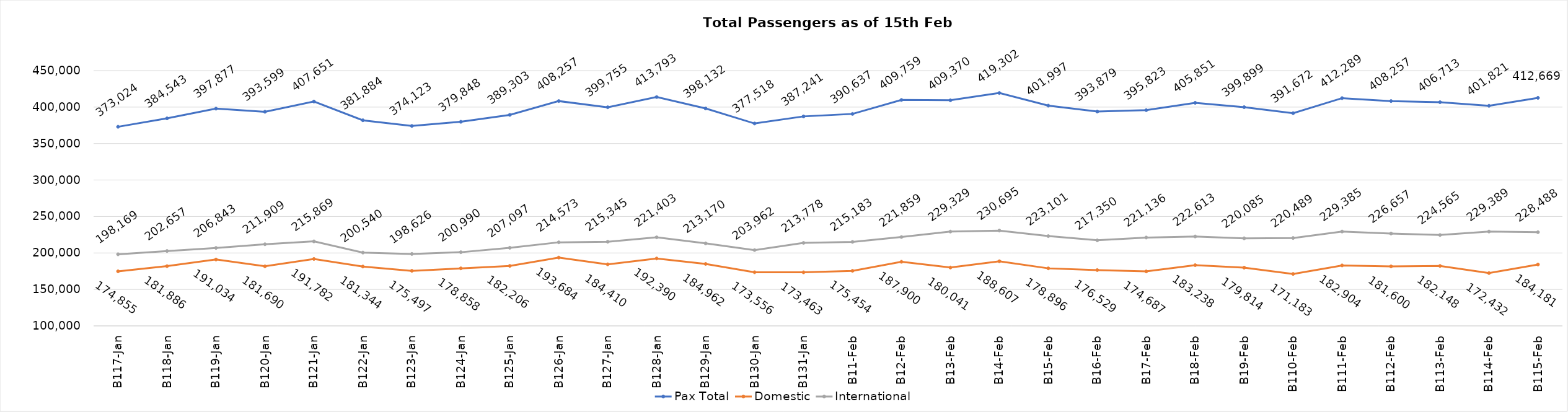
| Category | Pax Total | Domestic | International |
|---|---|---|---|
| 2024-01-17 | 373024 | 174855 | 198169 |
| 2024-01-18 | 384543 | 181886 | 202657 |
| 2024-01-19 | 397877 | 191034 | 206843 |
| 2024-01-20 | 393599 | 181690 | 211909 |
| 2024-01-21 | 407651 | 191782 | 215869 |
| 2024-01-22 | 381884 | 181344 | 200540 |
| 2024-01-23 | 374123 | 175497 | 198626 |
| 2024-01-24 | 379848 | 178858 | 200990 |
| 2024-01-25 | 389303 | 182206 | 207097 |
| 2024-01-26 | 408257 | 193684 | 214573 |
| 2024-01-27 | 399755 | 184410 | 215345 |
| 2024-01-28 | 413793 | 192390 | 221403 |
| 2024-01-29 | 398132 | 184962 | 213170 |
| 2024-01-30 | 377518 | 173556 | 203962 |
| 2024-01-31 | 387241 | 173463 | 213778 |
| 2024-02-01 | 390637 | 175454 | 215183 |
| 2024-02-02 | 409759 | 187900 | 221859 |
| 2024-02-03 | 409370 | 180041 | 229329 |
| 2024-02-04 | 419302 | 188607 | 230695 |
| 2024-02-05 | 401997 | 178896 | 223101 |
| 2024-02-06 | 393879 | 176529 | 217350 |
| 2024-02-07 | 395823 | 174687 | 221136 |
| 2024-02-08 | 405851 | 183238 | 222613 |
| 2024-02-09 | 399899 | 179814 | 220085 |
| 2024-02-10 | 391672 | 171183 | 220489 |
| 2024-02-11 | 412289 | 182904 | 229385 |
| 2024-02-12 | 408257 | 181600 | 226657 |
| 2024-02-13 | 406713 | 182148 | 224565 |
| 2024-02-14 | 401821 | 172432 | 229389 |
| 2024-02-15 | 412669 | 184181 | 228488 |